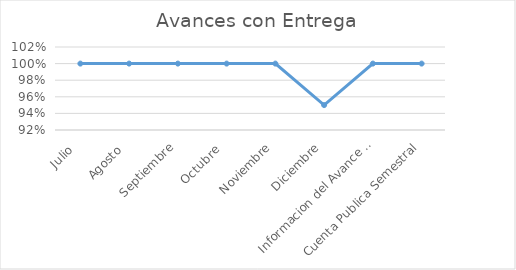
| Category | Series 0 |
|---|---|
| Julio  | 1 |
| Agosto  | 1 |
| Septiembre | 1 |
| Octubre  | 1 |
| Noviembre | 1 |
| Diciembre | 0.95 |
| Informacion del Avance en Gestion Financiera Sementral 2019 | 1 |
| Cuenta Publica Semestral | 1 |